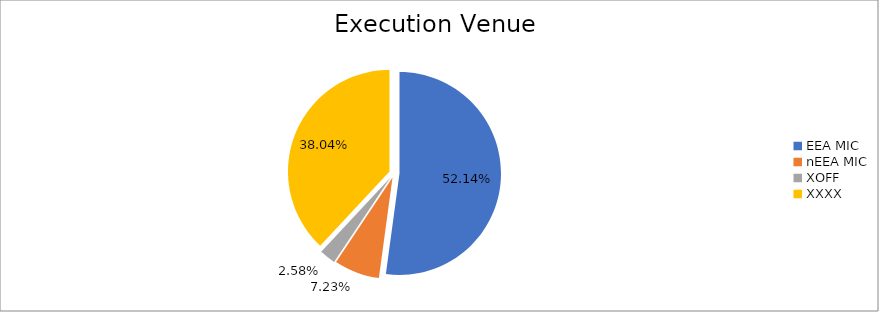
| Category | Series 0 |
|---|---|
| EEA MIC | 5906198.501 |
| nEEA MIC | 819415.701 |
| XOFF | 292279.915 |
| XXXX | 4308730.965 |